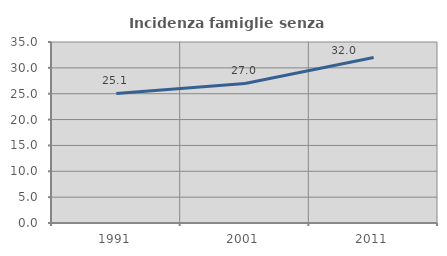
| Category | Incidenza famiglie senza nuclei |
|---|---|
| 1991.0 | 25.058 |
| 2001.0 | 26.993 |
| 2011.0 | 31.993 |